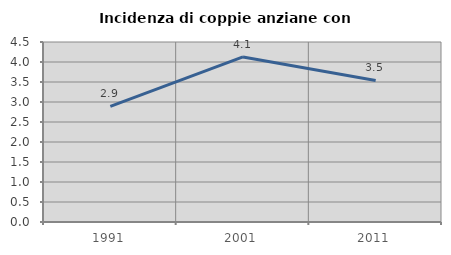
| Category | Incidenza di coppie anziane con figli |
|---|---|
| 1991.0 | 2.89 |
| 2001.0 | 4.127 |
| 2011.0 | 3.539 |